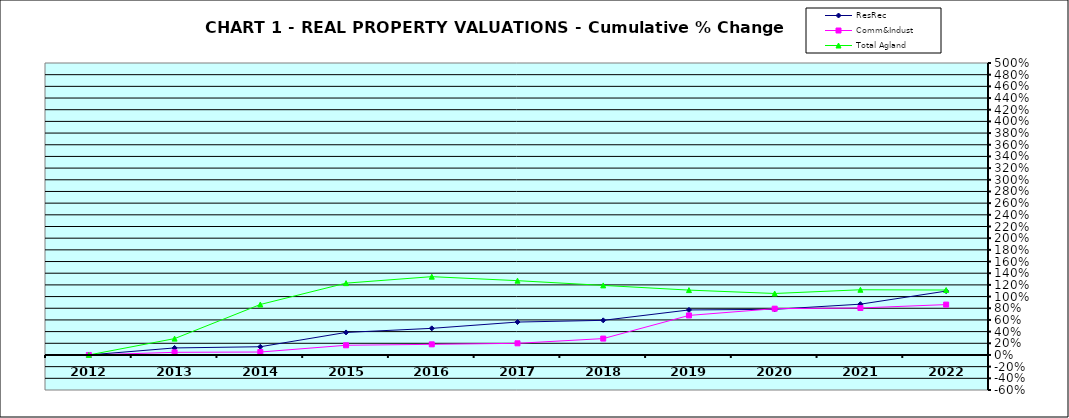
| Category | ResRec | Comm&Indust | Total Agland |
|---|---|---|---|
| 2012.0 | 0 | 0 | 0 |
| 2013.0 | 0.12 | 0.045 | 0.28 |
| 2014.0 | 0.141 | 0.05 | 0.864 |
| 2015.0 | 0.386 | 0.166 | 1.23 |
| 2016.0 | 0.456 | 0.182 | 1.341 |
| 2017.0 | 0.564 | 0.199 | 1.272 |
| 2018.0 | 0.593 | 0.28 | 1.191 |
| 2019.0 | 0.771 | 0.677 | 1.111 |
| 2020.0 | 0.782 | 0.793 | 1.053 |
| 2021.0 | 0.87 | 0.805 | 1.117 |
| 2022.0 | 1.094 | 0.862 | 1.112 |